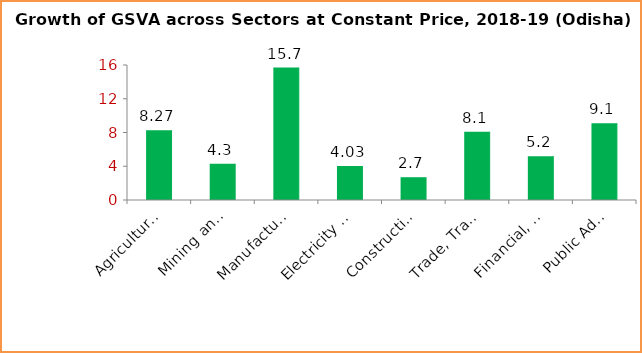
| Category |  Growth of GSVA Across Sectors at Constant Price , 2018-19 |
|---|---|
| Agriculture, Forestry and Fishing | 8.27 |
| Mining and Quarrying | 4.3 |
| Manufacturing | 15.7 |
| Electricity & Other Utility Services | 4.03 |
| Construction | 2.7 |
| Trade, Transport etc  | 8.1 |
| Financial,  Real estate etc | 5.2 |
| Public Admn etc. | 9.1 |